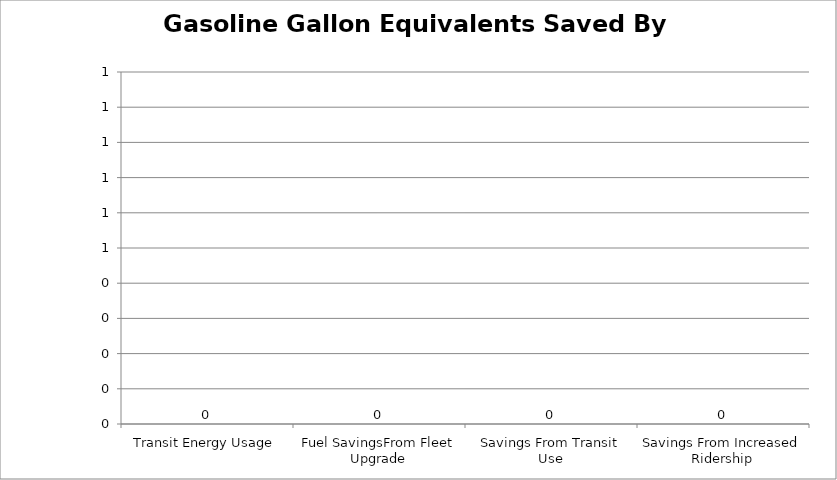
| Category | Series 0 |
|---|---|
| Transit Energy Usage | 0 |
| Fuel SavingsFrom Fleet Upgrade | 0 |
| Savings From Transit Use | 0 |
| Savings From Increased Ridership | 0 |